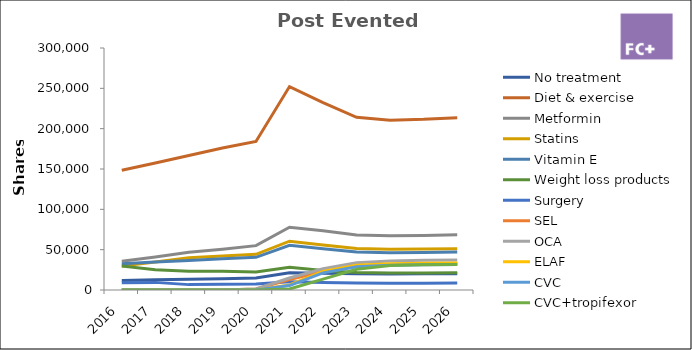
| Category | No treatment | Diet & exercise | Metformin | Statins | Vitamin E | Weight loss products | Surgery | SEL | OCA | ELAF | CVC | CVC+tropifexor |
|---|---|---|---|---|---|---|---|---|---|---|---|---|
| 2016.0 | 11880 | 148500 | 35640 | 29700 | 32670 | 29700 | 8910 | 0 | 0 | 0 | 0 | 0 |
| 2017.0 | 12598.74 | 157484.25 | 40945.905 | 34646.535 | 34646.535 | 25197.48 | 9449.055 | 0 | 0 | 0 | 0 | 0 |
| 2018.0 | 13330.667 | 166633.335 | 46657.334 | 39992 | 36659.334 | 23328.667 | 6665.333 | 0 | 0 | 0 | 0 | 0 |
| 2019.0 | 14075.972 | 175949.653 | 50628.845 | 42227.917 | 38708.924 | 23270.009 | 7037.986 | 0 | 0 | 0 | 0 | 0 |
| 2020.0 | 14834.851 | 184106.81 | 55009.764 | 44185.634 | 40503.498 | 22315.096 | 7364.272 | 1188.863 | 1362.48 | 0 | 0 | 0 |
| 2021.0 | 21393.5 | 252162.638 | 77815.144 | 60519.033 | 55475.78 | 28093.164 | 10086.506 | 12967.326 | 14851.309 | 6207.929 | 5521.55 | 1168.593 |
| 2022.0 | 20837.612 | 232264.294 | 73353.128 | 55743.43 | 51098.145 | 24197.876 | 9290.572 | 23027.948 | 26278.847 | 23030.376 | 21202.983 | 13468.894 |
| 2023.0 | 20013.61 | 214036.018 | 68229.338 | 51368.644 | 47087.924 | 21665.79 | 8561.441 | 29678.102 | 33797.861 | 30563.799 | 28760.091 | 25769.426 |
| 2024.0 | 19919.229 | 210560.005 | 67379.202 | 50534.401 | 46323.201 | 21056.001 | 8422.4 | 31679.989 | 36054.429 | 32388.02 | 30712.087 | 30298.4 |
| 2025.0 | 20071.174 | 211539.691 | 67692.701 | 50769.526 | 46538.732 | 21153.969 | 8461.588 | 32461.441 | 36942.499 | 33016.271 | 31332.574 | 31200.472 |
| 2026.0 | 20271.886 | 213655.088 | 68369.628 | 51277.221 | 47004.119 | 21365.509 | 8546.204 | 32786.055 | 37311.924 | 33346.434 | 31645.9 | 31512.477 |